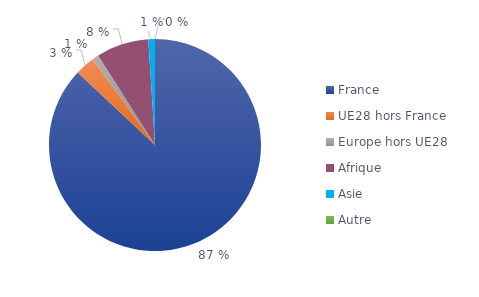
| Category | Series 0 |
|---|---|
| France | 0.87 |
| UE28 hors France | 0.03 |
| Europe hors UE28 | 0.01 |
| Afrique | 0.08 |
| Asie | 0.01 |
| Autre | 0 |